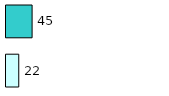
| Category | Series 0 | Series 1 |
|---|---|---|
| 0 | 22 | 45 |